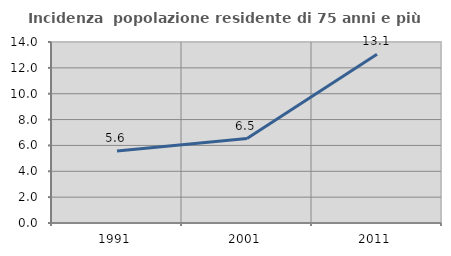
| Category | Incidenza  popolazione residente di 75 anni e più |
|---|---|
| 1991.0 | 5.563 |
| 2001.0 | 6.528 |
| 2011.0 | 13.057 |